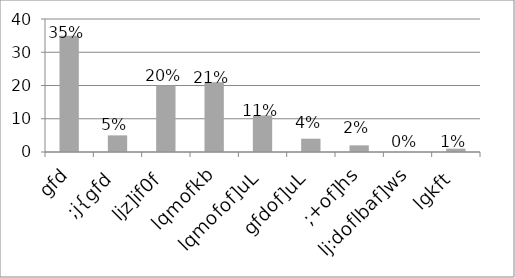
| Category | Series 0 |
|---|---|
| gfd | 35 |
| ;j{gfd | 5 |
| ljz]if0f | 20 |
| lqmofkb | 21 |
| lqmofof]uL | 11 |
| gfdof]uL | 4 |
| ;+of]hs | 2 |
| lj:doflbaf]ws | 0 |
| lgkft | 1 |